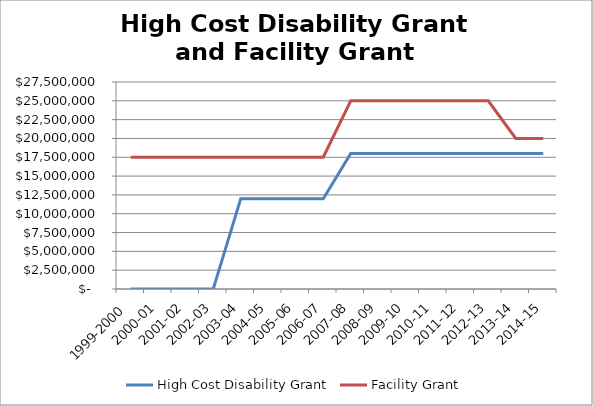
| Category | High Cost Disability Grant | Facility Grant |
|---|---|---|
| 1999-2000 | 0 | 17500000 |
| 2000-01 | 0 | 17500000 |
| 2001-02 | 0 | 17500000 |
| 2002-03 | 0 | 17500000 |
| 2003-04 | 12000000 | 17500000 |
| 2004-05 | 12000000 | 17500000 |
| 2005-06 | 12000000 | 17500000 |
| 2006-07 | 12000000 | 17500000 |
| 2007-08 | 18000000 | 25000000 |
| 2008-09 | 18000000 | 25000000 |
| 2009-10 | 18000000 | 25000000 |
| 2010-11 | 18000000 | 25000000 |
| 2011-12 | 18000000 | 25000000 |
| 2012-13 | 18000000 | 25000000 |
| 2013-14 | 18000000 | 20000000 |
| 2014-15 | 18000000 | 20000000 |